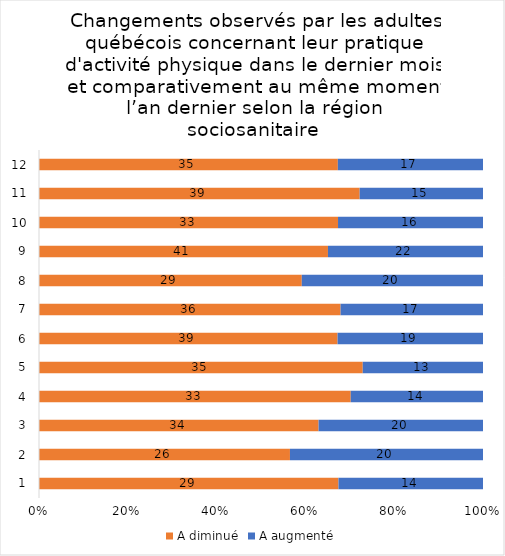
| Category | A diminué | A augmenté |
|---|---|---|
| 0 | 29 | 14 |
| 1 | 26 | 20 |
| 2 | 34 | 20 |
| 3 | 33 | 14 |
| 4 | 35 | 13 |
| 5 | 39 | 19 |
| 6 | 36 | 17 |
| 7 | 29 | 20 |
| 8 | 41 | 22 |
| 9 | 33 | 16 |
| 10 | 39 | 15 |
| 11 | 35 | 17 |